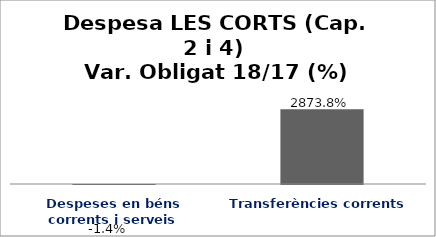
| Category | Series 0 |
|---|---|
| Despeses en béns corrents i serveis | -0.014 |
| Transferències corrents | 28.738 |